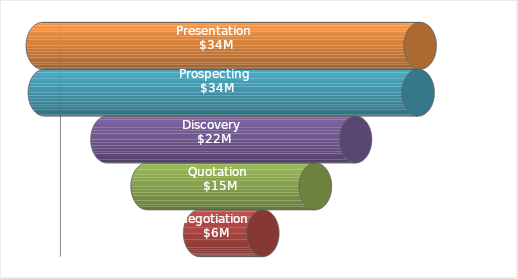
| Category | Filler Series | Sales |
|---|---|---|
| Presentation | 0 | 34000000 |
| Prospecting | 184137.5 | 33631725 |
| Discovery | 5816856 | 22366288 |
| Quotation | 9431559.965 | 15136880.07 |
| Negotiation | 14160752.5 | 5678495 |